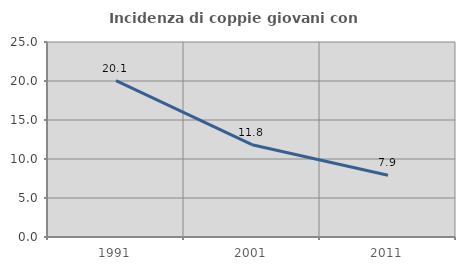
| Category | Incidenza di coppie giovani con figli |
|---|---|
| 1991.0 | 20.056 |
| 2001.0 | 11.835 |
| 2011.0 | 7.908 |